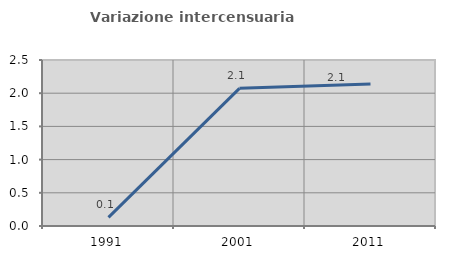
| Category | Variazione intercensuaria annua |
|---|---|
| 1991.0 | 0.131 |
| 2001.0 | 2.074 |
| 2011.0 | 2.138 |